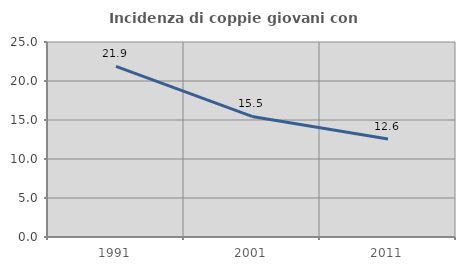
| Category | Incidenza di coppie giovani con figli |
|---|---|
| 1991.0 | 21.864 |
| 2001.0 | 15.457 |
| 2011.0 | 12.552 |